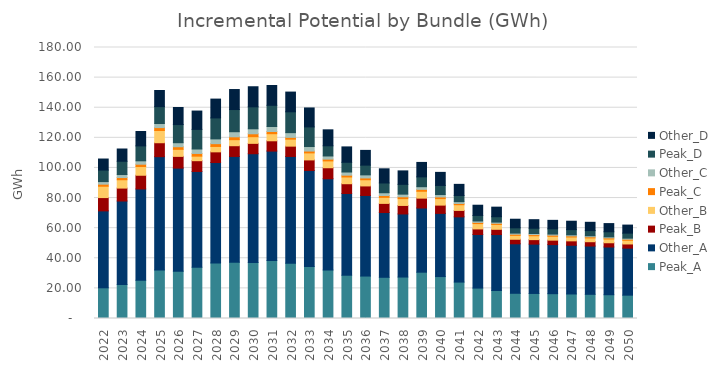
| Category | Peak_A | Other_A | Peak_B | Other_B | Peak_C | Other_C | Peak_D | Other_D |
|---|---|---|---|---|---|---|---|---|
| 2022.0 | 20.392 | 51.084 | 8.839 | 7.53 | 1.374 | 1.708 | 7.651 | 7.35 |
| 2023.0 | 22.596 | 55.435 | 8.591 | 5.542 | 1.462 | 1.991 | 8.803 | 8.158 |
| 2024.0 | 25.374 | 60.68 | 9.093 | 5.785 | 1.545 | 2.258 | 9.914 | 9.542 |
| 2025.0 | 32.28 | 75.217 | 9.25 | 8.124 | 1.925 | 2.7 | 11.22 | 10.73 |
| 2026.0 | 31.407 | 68.482 | 7.795 | 4.675 | 1.726 | 2.672 | 12.053 | 11.345 |
| 2027.0 | 34.053 | 63.614 | 7.155 | 3.01 | 1.795 | 2.956 | 13.015 | 12.189 |
| 2028.0 | 36.937 | 66.678 | 7.078 | 3.585 | 1.856 | 3.168 | 13.917 | 12.512 |
| 2029.0 | 37.423 | 70.219 | 7.121 | 4.005 | 1.913 | 3.377 | 14.733 | 13.293 |
| 2030.0 | 37.17 | 72.271 | 6.891 | 4.427 | 1.935 | 3.31 | 14.581 | 13.344 |
| 2031.0 | 38.544 | 72.643 | 6.853 | 4.708 | 1.464 | 3.297 | 14.087 | 13.177 |
| 2032.0 | 36.724 | 70.901 | 6.861 | 4.623 | 1.212 | 3.121 | 13.857 | 13.093 |
| 2033.0 | 34.476 | 63.866 | 6.994 | 4.666 | 1.214 | 3.004 | 13.033 | 12.595 |
| 2034.0 | 32.227 | 60.594 | 7.308 | 4.547 | 1.191 | 2.086 | 6.756 | 10.61 |
| 2035.0 | 28.739 | 54.292 | 6.49 | 4.479 | 1.197 | 2.104 | 6.46 | 10.216 |
| 2036.0 | 28.189 | 53.537 | 6.33 | 4.097 | 1.214 | 2.035 | 6.465 | 9.79 |
| 2037.0 | 27.368 | 43.037 | 6.051 | 4.002 | 1.231 | 1.84 | 6.478 | 9.415 |
| 2038.0 | 27.527 | 41.91 | 5.656 | 4.513 | 1.249 | 1.745 | 6.5 | 8.944 |
| 2039.0 | 30.751 | 42.652 | 6.546 | 4.562 | 1.266 | 1.77 | 6.526 | 9.592 |
| 2040.0 | 27.856 | 41.959 | 5.496 | 4.317 | 1.112 | 1.579 | 6.063 | 8.676 |
| 2041.0 | 24.185 | 43.335 | 4.269 | 3.783 | 0.843 | 1.193 | 4.093 | 7.399 |
| 2042.0 | 20.203 | 35.603 | 3.695 | 3.542 | 0.797 | 0.942 | 3.663 | 6.797 |
| 2043.0 | 18.579 | 37.185 | 3.478 | 3.228 | 0.775 | 0.781 | 3.579 | 6.354 |
| 2044.0 | 16.749 | 32.861 | 3.013 | 2.602 | 0.755 | 0.743 | 3.496 | 5.722 |
| 2045.0 | 16.634 | 32.763 | 2.993 | 2.586 | 0.752 | 0.737 | 3.484 | 5.688 |
| 2046.0 | 16.481 | 32.597 | 2.964 | 2.567 | 0.749 | 0.729 | 3.467 | 5.643 |
| 2047.0 | 16.291 | 32.362 | 2.928 | 2.543 | 0.744 | 0.719 | 3.444 | 5.586 |
| 2048.0 | 16.063 | 32.058 | 2.884 | 2.515 | 0.738 | 0.707 | 3.416 | 5.518 |
| 2049.0 | 15.797 | 31.686 | 2.831 | 2.482 | 0.732 | 0.693 | 3.382 | 5.438 |
| 2050.0 | 15.494 | 31.246 | 2.77 | 2.446 | 0.724 | 0.677 | 3.344 | 5.346 |